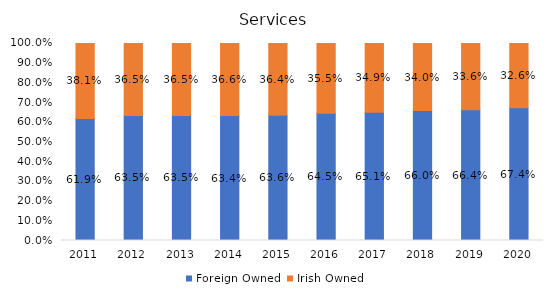
| Category | Foreign Owned | Irish Owned |
|---|---|---|
| 2011.0 | 0.619 | 0.381 |
| 2012.0 | 0.635 | 0.365 |
| 2013.0 | 0.635 | 0.365 |
| 2014.0 | 0.634 | 0.366 |
| 2015.0 | 0.636 | 0.364 |
| 2016.0 | 0.645 | 0.355 |
| 2017.0 | 0.651 | 0.349 |
| 2018.0 | 0.66 | 0.34 |
| 2019.0 | 0.664 | 0.336 |
| 2020.0 | 0.674 | 0.326 |